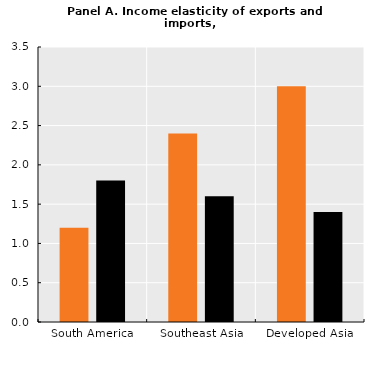
| Category | Income elasticity of exports | Income elasticity of imports |
|---|---|---|
| South America | 1.2 | 1.8 |
| Southeast Asia | 2.4 | 1.6 |
| Developed Asia | 3 | 1.4 |